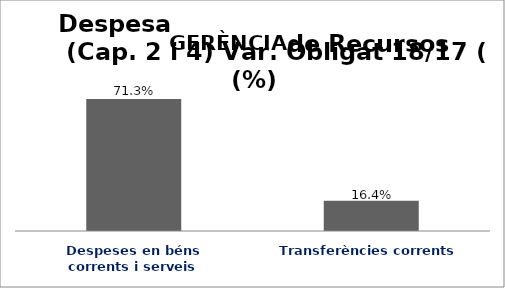
| Category | Series 0 |
|---|---|
| Despeses en béns corrents i serveis | 0.713 |
| Transferències corrents | 0.164 |